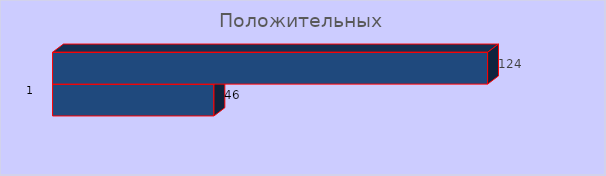
| Category | положительных | Series 0 |
|---|---|---|
| 0 | 46 | 124 |